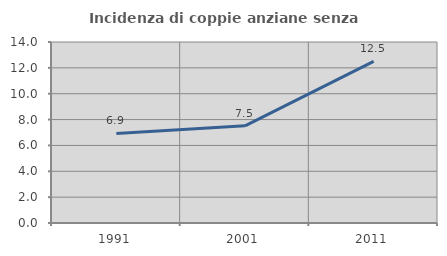
| Category | Incidenza di coppie anziane senza figli  |
|---|---|
| 1991.0 | 6.926 |
| 2001.0 | 7.519 |
| 2011.0 | 12.5 |